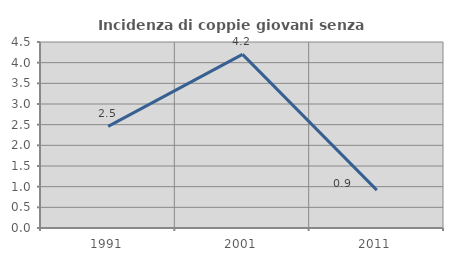
| Category | Incidenza di coppie giovani senza figli |
|---|---|
| 1991.0 | 2.459 |
| 2001.0 | 4.202 |
| 2011.0 | 0.917 |